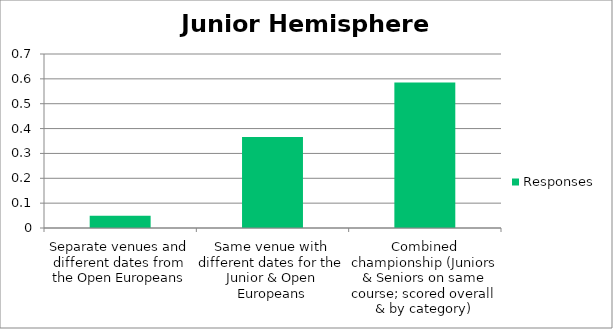
| Category | Responses |
|---|---|
| ;Separate venues and different dates from the Open Europeans | 0.049 |
| ?Same venue with different dates for the Junior & Open Europeans | 0.366 |
| VCombined championship (Juniors & Seniors on same course; scored overall & by category) | 0.585 |